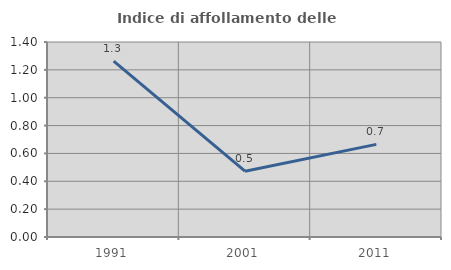
| Category | Indice di affollamento delle abitazioni  |
|---|---|
| 1991.0 | 1.263 |
| 2001.0 | 0.472 |
| 2011.0 | 0.665 |